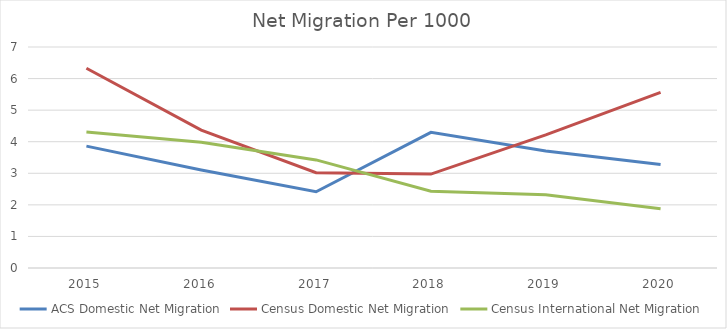
| Category | ACS Domestic Net Migration | Census Domestic Net Migration | Census International Net Migration |
|---|---|---|---|
| 2015.0 | 3.86 | 6.327 | 4.309 |
| 2016.0 | 3.106 | 4.369 | 3.986 |
| 2017.0 | 2.415 | 3.018 | 3.424 |
| 2018.0 | 4.296 | 2.974 | 2.429 |
| 2019.0 | 3.709 | 4.215 | 2.319 |
| 2020.0 | 3.277 | 5.563 | 1.873 |